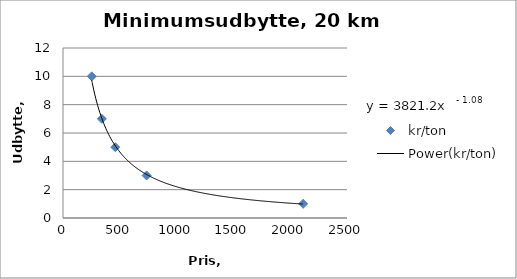
| Category | kr/ton |
|---|---|
| 2114.0 | 1 |
| 736.0 | 3 |
| 460.0 | 5 |
| 342.0 | 7 |
| 253.0 | 10 |